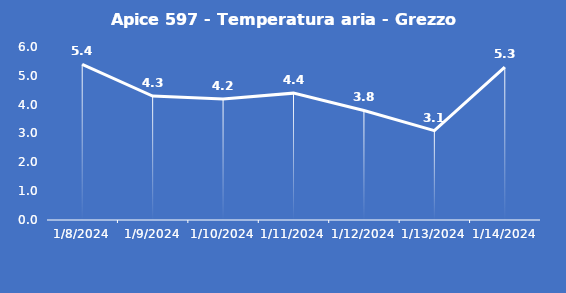
| Category | Apice 597 - Temperatura aria - Grezzo (°C) |
|---|---|
| 1/8/24 | 5.4 |
| 1/9/24 | 4.3 |
| 1/10/24 | 4.2 |
| 1/11/24 | 4.4 |
| 1/12/24 | 3.8 |
| 1/13/24 | 3.1 |
| 1/14/24 | 5.3 |